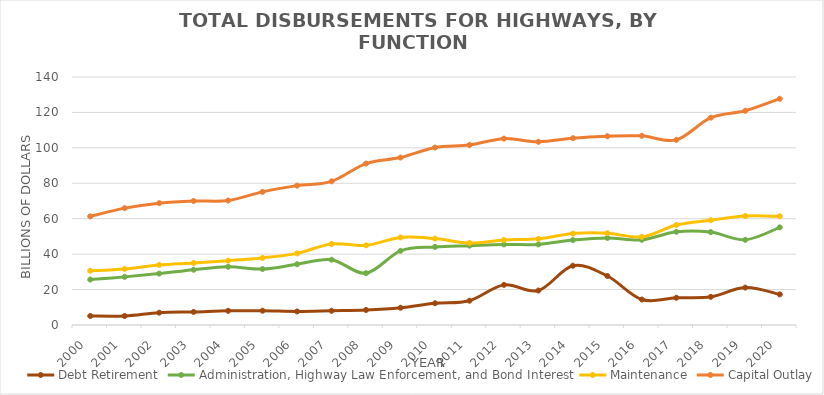
| Category | Debt | Administration, Highway Law | Maintenance | Capital Outlay |
|---|---|---|---|---|
| 2000.0 | 5.105 | 25.634 | 30.636 | 61.323 |
| 2001.0 | 5.086 | 27.17 | 31.677 | 65.968 |
| 2002.0 | 6.945 | 29.008 | 33.893 | 68.794 |
| 2003.0 | 7.393 | 31.198 | 35.011 | 70.004 |
| 2004.0 | 8.011 | 32.878 | 36.327 | 70.274 |
| 2005.0 | 8.071 | 31.584 | 37.882 | 75.162 |
| 2006.0 | 7.648 | 34.311 | 40.426 | 78.676 |
| 2007.0 | 8.032 | 36.864 | 45.759 | 81.098 |
| 2008.0 | 8.477 | 29.276 | 44.972 | 91.144 |
| 2009.0 | 9.734 | 41.887 | 49.432 | 94.525 |
| 2010.0 | 12.279 | 44.087 | 48.773 | 100.175 |
| 2011.0 | 13.713 | 44.804 | 46.311 | 101.612 |
| 2012.0 | 22.649 | 45.481 | 47.99 | 105.199 |
| 2013.0 | 19.459 | 45.493 | 48.655 | 103.426 |
| 2014.0 | 33.453 | 47.93 | 51.593 | 105.452 |
| 2015.0 | 27.658 | 49.181 | 51.817 | 106.539 |
| 2016.0 | 14.384 | 48.088 | 49.749 | 106.78 |
| 2017.0 | 15.383 | 52.616 | 56.466 | 104.512 |
| 2018.0 | 15.89 | 52.445 | 59.139 | 117.025 |
| 2019.0 | 21.123 | 48.088 | 61.503 | 120.934 |
| 2020.0 | 17.287 | 55.132 | 61.346 | 127.716 |